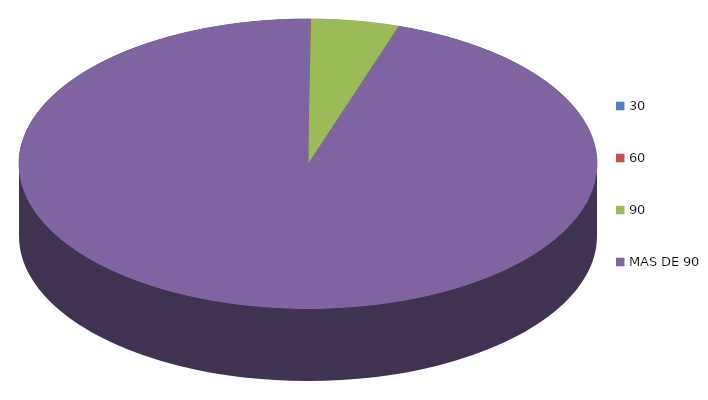
| Category | Series 0 | 51,552.8 |
|---|---|---|
| 0 | 51552.8 |  |
| 1 | 54153.4 |  |
| 2 | 3083256.9 |  |
| 3 | 59605695.1 |  |